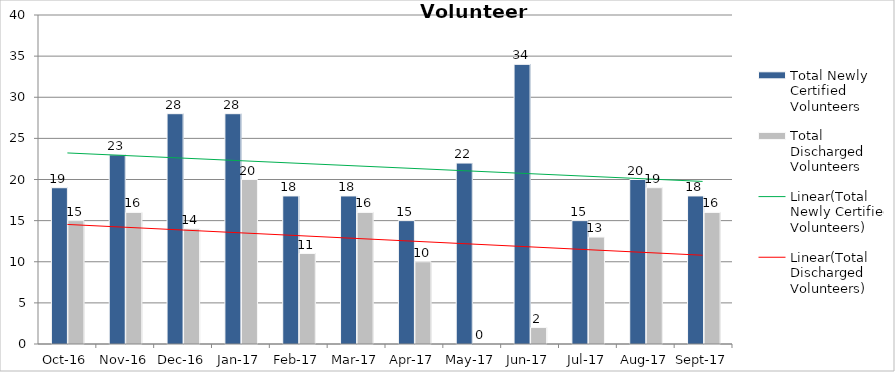
| Category | Total Newly Certified Volunteers | Total Discharged Volunteers |
|---|---|---|
| 2016-10-01 | 19 | 15 |
| 2016-11-01 | 23 | 16 |
| 2016-12-01 | 28 | 14 |
| 2017-01-01 | 28 | 20 |
| 2017-02-01 | 18 | 11 |
| 2017-03-01 | 18 | 16 |
| 2017-04-01 | 15 | 10 |
| 2017-05-01 | 22 | 0 |
| 2017-06-01 | 34 | 2 |
| 2017-07-01 | 15 | 13 |
| 2017-08-01 | 20 | 19 |
| 2017-09-01 | 18 | 16 |